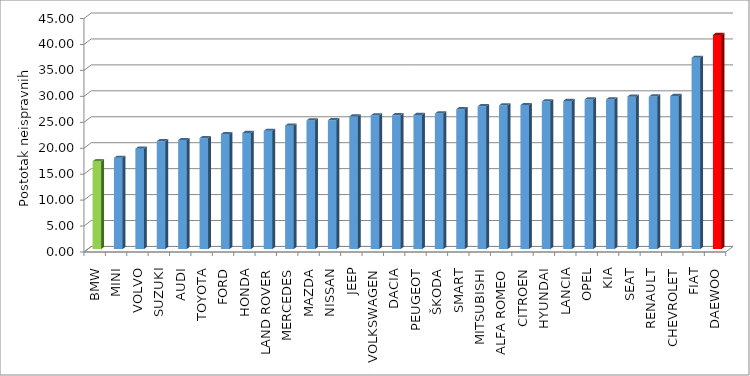
| Category | Series 4 |
|---|---|
| BMW | 16.93 |
| MINI | 17.586 |
| VOLVO | 19.34 |
| SUZUKI | 20.807 |
| AUDI | 21.01 |
| TOYOTA | 21.383 |
| FORD | 22.165 |
| HONDA | 22.386 |
| LAND ROVER | 22.793 |
| MERCEDES | 23.799 |
| MAZDA | 24.797 |
| NISSAN | 24.84 |
| JEEP | 25.578 |
| VOLKSWAGEN | 25.752 |
| DACIA | 25.825 |
| PEUGEOT | 25.848 |
| ŠKODA | 26.126 |
| SMART | 26.949 |
| MITSUBISHI | 27.528 |
| ALFA ROMEO | 27.706 |
| CITROEN | 27.753 |
| HYUNDAI | 28.48 |
| LANCIA | 28.546 |
| OPEL | 28.85 |
| KIA | 28.851 |
| SEAT | 29.391 |
| RENAULT | 29.399 |
| CHEVROLET | 29.498 |
| FIAT | 36.863 |
| DAEWOO | 41.282 |